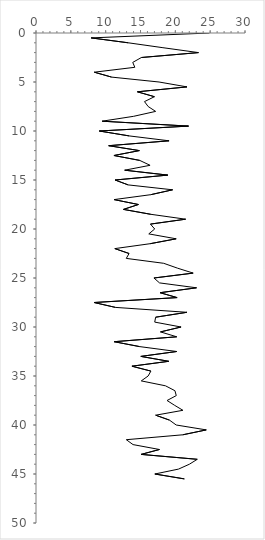
| Category | Series 0 |
|---|---|
| 24.88888888888889 | 0 |
| 7.912353347135956 | 0.5 |
| 13.247863247863245 | 1 |
| 18.218475073313783 | 1.5 |
| 23.32112332112332 | 2 |
| 15.132275132275133 | 2.5 |
| 13.888888888888891 | 3 |
| 14.183363691560414 | 3.5 |
| 8.36734693877551 | 4 |
| 10.849673202614378 | 4.5 |
| 17.663817663817664 | 5 |
| 21.67676767676768 | 5.5 |
| 14.558029689608638 | 6 |
| 16.998556998557 | 6.5 |
| 15.572263993316627 | 7 |
| 16.098191214470287 | 7.5 |
| 17.171717171717173 | 8 |
| 14.02116402116402 | 8.5 |
| 9.49074074074074 | 9 |
| 21.89274721463563 | 9.5 |
| 9.084967320261438 | 10 |
| 13.366841491841493 | 10.5 |
| 19.100407747196737 | 11 |
| 10.434472934472934 | 11.5 |
| 14.835858585858587 | 12 |
| 11.188811188811188 | 12.5 |
| 14.88927738927739 | 13 |
| 16.372924648786718 | 13.5 |
| 12.727272727272728 | 14 |
| 18.92230576441103 | 14.5 |
| 11.356606835006593 | 15 |
| 13.22737686139748 | 15.5 |
| 19.614512471655328 | 16 |
| 16.45622895622896 | 16.5 |
| 11.203703703703704 | 17 |
| 14.7008547008547 | 17.5 |
| 12.554112554112555 | 18 |
| 16.47727272727273 | 18.5 |
| 21.48148148148148 | 19 |
| 16.428571428571427 | 19.5 |
| 17.037037037037038 | 20 |
| 16.19047619047619 | 20.5 |
| 20.121316255336875 | 21 |
| 16.38888888888889 | 21.5 |
| 11.313131313131313 | 22 |
| 13.358395989974937 | 22.5 |
| 12.960662525879917 | 23 |
| 18.333333333333336 | 23.5 |
| 20.327260458839405 | 24 |
| 22.558922558922557 | 24.5 |
| 16.929951140477456 | 25 |
| 17.73109243697479 | 25.5 |
| 23.04318488529015 | 26 |
| 17.805800756620428 | 26.5 |
| 20.25641025641026 | 27 |
| 8.335232019442545 | 27.5 |
| 11.40461215932914 | 28 |
| 21.666666666666668 | 28.5 |
| 17.17436974789916 | 29 |
| 17.04318571271361 | 29.5 |
| 20.822634609399316 | 30 |
| 17.868408919948557 | 30.5 |
| 20.202020202020204 | 31 |
| 11.212861212861213 | 31.5 |
| 14.874939874939875 | 32 |
| 20.202020202020204 | 32.5 |
| 15.047827428539371 | 33 |
| 19.05458089668616 | 33.5 |
| 13.771043771043772 | 34 |
| 16.491841491841495 | 34.5 |
| 16.096491228070175 | 35 |
| 15.110126738033713 | 35.5 |
| 18.58585858585859 | 36 |
| 19.943019943019944 | 36.5 |
| 20.134680134680135 | 37 |
| 18.81313131313131 | 37.5 |
| 19.91452991452992 | 38 |
| 21.091000502765212 | 38.5 |
| 17.17524249713091 | 39 |
| 19.155844155844154 | 39.5 |
| 20.128205128205128 | 40 |
| 24.444444444444446 | 40.5 |
| 21.060606060606062 | 41 |
| 12.962962962962962 | 41.5 |
| 13.93097643097643 | 42 |
| 17.724867724867725 | 42.5 |
| 15.07936507936508 | 43 |
| 23.14814814814815 | 43.5 |
| 22.023809523809522 | 44 |
| 20.454545454545457 | 44.5 |
| 17.058029689608635 | 45 |
| 21.296296296296294 | 45.5 |